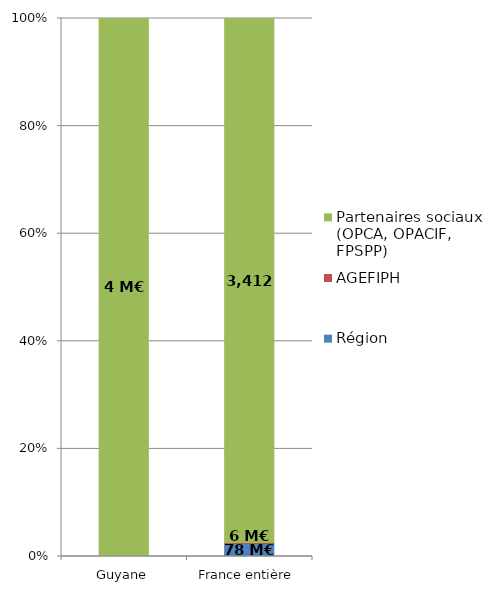
| Category | Région | AGEFIPH | Partenaires sociaux (OPCA, OPACIF, FPSPP) |
|---|---|---|---|
| Guyane | 0 | 0 | 3.983 |
| France entière | 77.612 | 6.161 | 3411.683 |